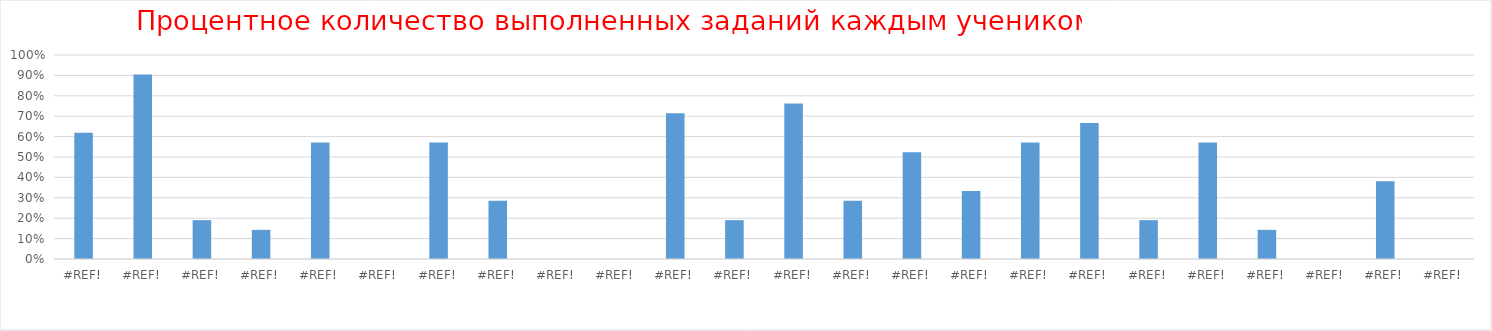
| Category | Series 0 |
|---|---|
| 0.0 | 0.619 |
| 0.0 | 0.905 |
| 0.0 | 0.19 |
| 0.0 | 0.143 |
| 0.0 | 0.571 |
| 0.0 | 0 |
| 0.0 | 0.571 |
| 0.0 | 0.286 |
| 0.0 | 0 |
| 0.0 | 0 |
| 0.0 | 0.714 |
| 0.0 | 0.19 |
| 0.0 | 0.762 |
| 0.0 | 0.286 |
| 0.0 | 0.524 |
| 0.0 | 0.333 |
| 0.0 | 0.571 |
| 0.0 | 0.667 |
| 0.0 | 0.19 |
| 0.0 | 0.571 |
| 0.0 | 0.143 |
| 0.0 | 0 |
| 0.0 | 0.381 |
| 0.0 | 0 |